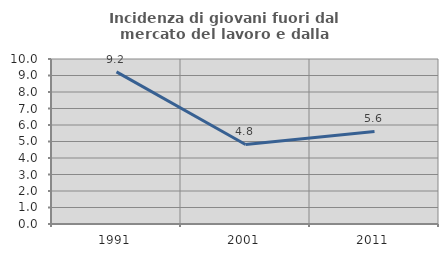
| Category | Incidenza di giovani fuori dal mercato del lavoro e dalla formazione  |
|---|---|
| 1991.0 | 9.219 |
| 2001.0 | 4.821 |
| 2011.0 | 5.611 |